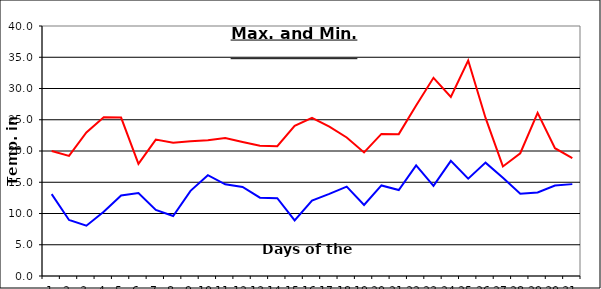
| Category | Series 0 | Series 1 |
|---|---|---|
| 0 | 20.01 | 13.1 |
| 1 | 19.21 | 8.96 |
| 2 | 22.97 | 8.05 |
| 3 | 25.41 | 10.29 |
| 4 | 25.35 | 12.89 |
| 5 | 17.94 | 13.26 |
| 6 | 21.83 | 10.58 |
| 7 | 21.34 | 9.6 |
| 8 | 21.55 | 13.63 |
| 9 | 21.72 | 16.13 |
| 10 | 22.09 | 14.67 |
| 11 | 21.44 | 14.24 |
| 12 | 20.85 | 12.53 |
| 13 | 20.77 | 12.44 |
| 14 | 24.01 | 8.89 |
| 15 | 25.3 | 12.05 |
| 16 | 23.89 | 13.13 |
| 17 | 22.16 | 14.3 |
| 18 | 19.77 | 11.37 |
| 19 | 22.73 | 14.49 |
| 20 | 22.7 | 13.75 |
| 21 | 27.29 | 17.71 |
| 22 | 31.71 | 14.41 |
| 23 | 28.66 | 18.42 |
| 24 | 34.47 | 15.57 |
| 25 | 25.29 | 18.14 |
| 26 | 17.53 | 15.71 |
| 27 | 19.64 | 13.16 |
| 28 | 26.1 | 13.36 |
| 29 | 20.45 | 14.47 |
| 30 | 18.87 | 14.7 |